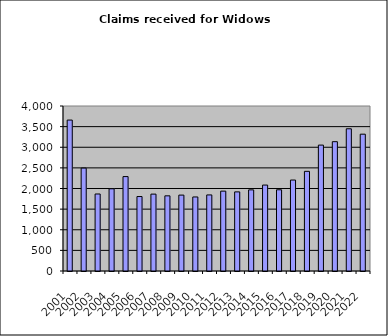
| Category | Series 1 |
|---|---|
| 2001.0 | 3659 |
| 2002.0 | 2495 |
| 2003.0 | 1867 |
| 2004.0 | 1993 |
| 2005.0 | 2289 |
| 2006.0 | 1805 |
| 2007.0 | 1864 |
| 2008.0 | 1822 |
| 2009.0 | 1840 |
| 2010.0 | 1795 |
| 2011.0 | 1844 |
| 2012.0 | 1936 |
| 2013.0 | 1918 |
| 2014.0 | 1967 |
| 2015.0 | 2083 |
| 2016.0 | 1969 |
| 2017.0 | 2205 |
| 2018.0 | 2416 |
| 2019.0 | 3052 |
| 2020.0 | 3135 |
| 2021.0 | 3448 |
| 2022.0 | 3317 |